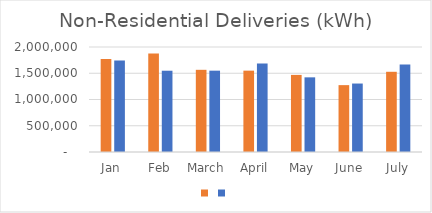
| Category | Series 1 | Series 0 |
|---|---|---|
| Jan | 1770828 | 1741151 |
| Feb | 1874770 | 1548063 |
| March | 1565360 | 1549153 |
| April | 1549578 | 1684688 |
| May | 1468470 | 1421957 |
| June | 1273660 | 1304116 |
| July | 1527956 | 1664865 |